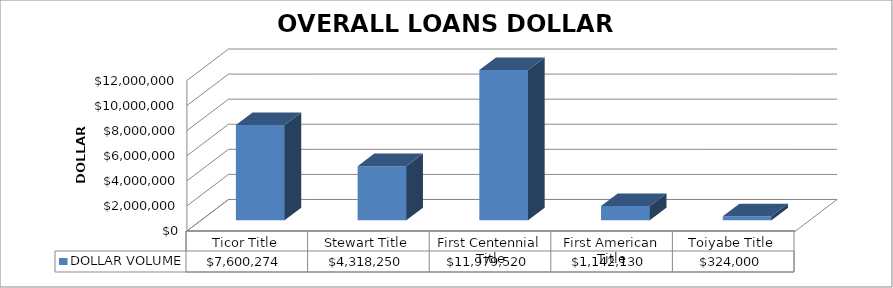
| Category | DOLLAR VOLUME |
|---|---|
| Ticor Title | 7600274 |
| Stewart Title | 4318250 |
| First Centennial Title | 11979520 |
| First American Title | 1142130 |
| Toiyabe Title | 324000 |